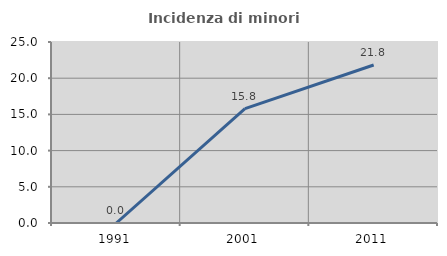
| Category | Incidenza di minori stranieri |
|---|---|
| 1991.0 | 0 |
| 2001.0 | 15.789 |
| 2011.0 | 21.818 |